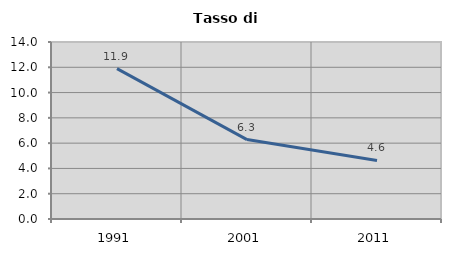
| Category | Tasso di disoccupazione   |
|---|---|
| 1991.0 | 11.897 |
| 2001.0 | 6.283 |
| 2011.0 | 4.628 |